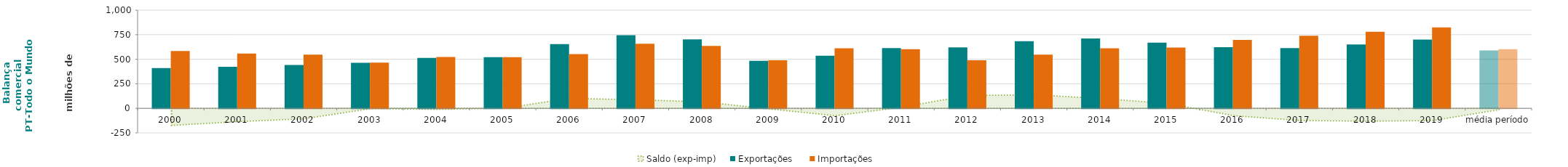
| Category | Exportações  | Importações  |
|---|---|---|
| 2000 | 410.881 | 584.618 |
| 2001 | 422.987 | 558.493 |
| 2002 | 440.675 | 546.906 |
| 2003 | 462.9 | 466.038 |
| 2004 | 512.99 | 523.096 |
| 2005 | 521.41 | 521.422 |
| 2006 | 653.809 | 552.036 |
| 2007 | 745.651 | 658.008 |
| 2008 | 701.978 | 636.292 |
| 2009 | 483.527 | 489.45 |
| 2010 | 536.738 | 611.548 |
| 2011 | 613.894 | 602.41 |
| 2012 | 620.129 | 489.185 |
| 2013 | 684.013 | 546.474 |
| 2014 | 710.992 | 610.843 |
| 2015 | 668.539 | 618.596 |
| 2016 | 622.408 | 697.11 |
| 2017 | 614.052 | 738.356 |
| 2018 | 649.784 | 780.705 |
| 2019 | 699.595 | 824.089 |
| média período | 588.848 | 602.784 |